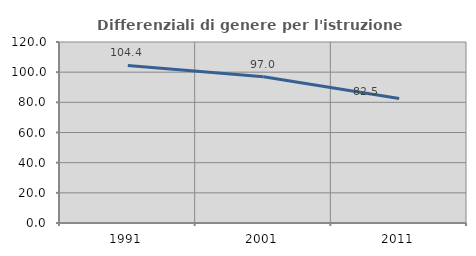
| Category | Differenziali di genere per l'istruzione superiore |
|---|---|
| 1991.0 | 104.449 |
| 2001.0 | 96.979 |
| 2011.0 | 82.544 |